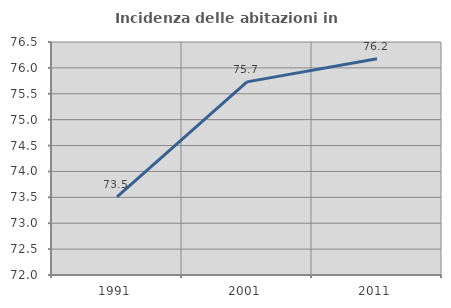
| Category | Incidenza delle abitazioni in proprietà  |
|---|---|
| 1991.0 | 73.511 |
| 2001.0 | 75.73 |
| 2011.0 | 76.176 |